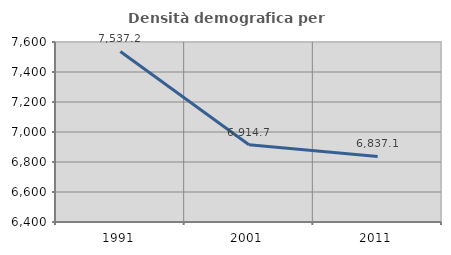
| Category | Densità demografica |
|---|---|
| 1991.0 | 7537.153 |
| 2001.0 | 6914.693 |
| 2011.0 | 6837.147 |